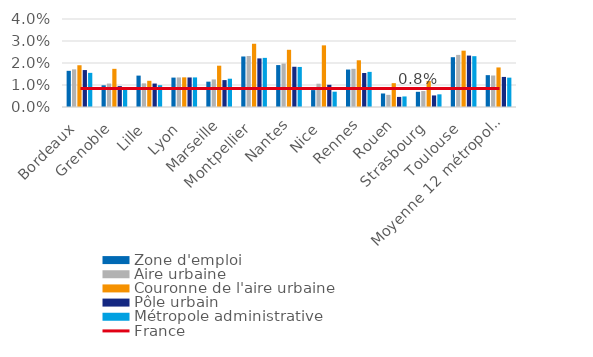
| Category | Zone d'emploi | Aire urbaine | Couronne de l'aire urbaine | Pôle urbain | Métropole administrative |
|---|---|---|---|---|---|
| Bordeaux | 0.016 | 0.017 | 0.019 | 0.017 | 0.016 |
| Grenoble | 0.01 | 0.011 | 0.017 | 0.009 | 0.008 |
| Lille | 0.014 | 0.011 | 0.012 | 0.011 | 0.01 |
| Lyon | 0.013 | 0.013 | 0.013 | 0.013 | 0.013 |
| Marseille | 0.012 | 0.013 | 0.019 | 0.012 | 0.013 |
| Montpellier | 0.023 | 0.023 | 0.029 | 0.022 | 0.022 |
| Nantes | 0.019 | 0.02 | 0.026 | 0.018 | 0.018 |
| Nice | 0.008 | 0.011 | 0.028 | 0.01 | 0.007 |
| Rennes | 0.017 | 0.017 | 0.021 | 0.015 | 0.016 |
| Rouen | 0.006 | 0.006 | 0.011 | 0.005 | 0.005 |
| Strasbourg | 0.007 | 0.007 | 0.012 | 0.005 | 0.006 |
| Toulouse | 0.023 | 0.024 | 0.026 | 0.023 | 0.023 |
| Moyenne 12 métropoles | 0.014 | 0.014 | 0.018 | 0.014 | 0.013 |